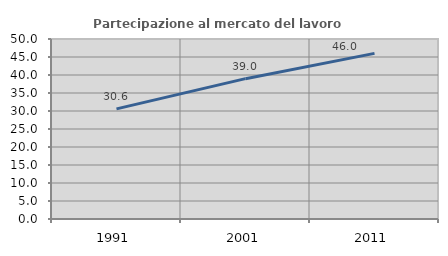
| Category | Partecipazione al mercato del lavoro  femminile |
|---|---|
| 1991.0 | 30.588 |
| 2001.0 | 38.983 |
| 2011.0 | 46 |